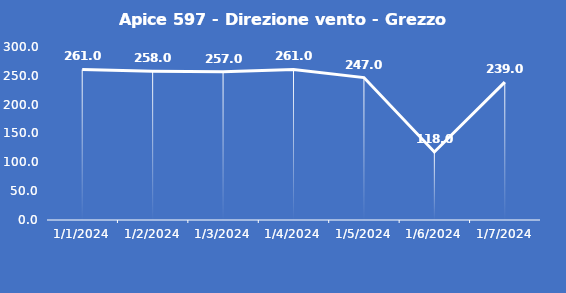
| Category | Apice 597 - Direzione vento - Grezzo (°N) |
|---|---|
| 1/1/24 | 261 |
| 1/2/24 | 258 |
| 1/3/24 | 257 |
| 1/4/24 | 261 |
| 1/5/24 | 247 |
| 1/6/24 | 118 |
| 1/7/24 | 239 |